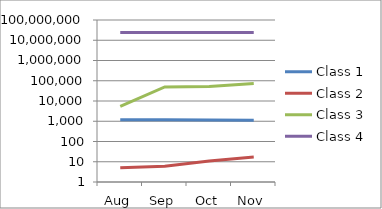
| Category | Class 1 | Class 2 | Class 3 | Class 4 |
|---|---|---|---|---|
| Aug | 1187 | 5 | 5487 | 23954318 |
| Sep | 1184 | 6 | 49493 | 23932519 |
| Oct | 1160 | 11 | 51752 | 23944918 |
| Nov | 1131 | 17 | 74030 | 23941127 |